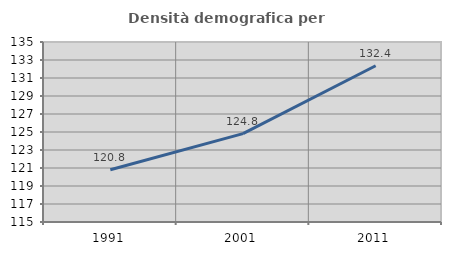
| Category | Densità demografica |
|---|---|
| 1991.0 | 120.8 |
| 2001.0 | 124.815 |
| 2011.0 | 132.359 |